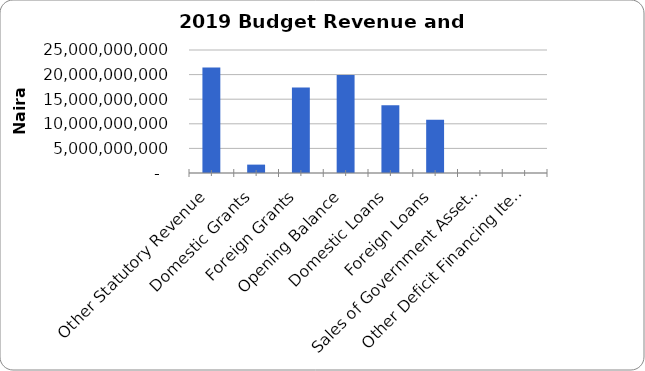
| Category | Series 0 |
|---|---|
| Other Statutory Revenue | 21443976609 |
| Domestic Grants | 1704000000 |
| Foreign Grants | 17356824700 |
| Opening Balance | 19936086956 |
| Domestic Loans | 13750000000 |
| Foreign Loans | 10835144951 |
| Sales of Government Assets  | 0 |
| Other Deficit Financing Items  | 0 |